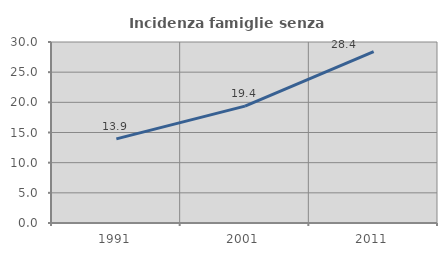
| Category | Incidenza famiglie senza nuclei |
|---|---|
| 1991.0 | 13.942 |
| 2001.0 | 19.364 |
| 2011.0 | 28.388 |